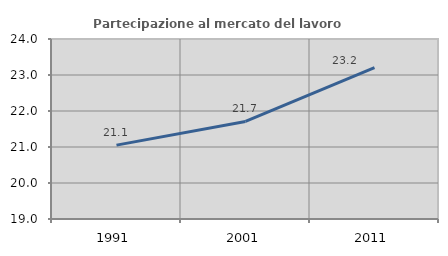
| Category | Partecipazione al mercato del lavoro  femminile |
|---|---|
| 1991.0 | 21.053 |
| 2001.0 | 21.709 |
| 2011.0 | 23.203 |